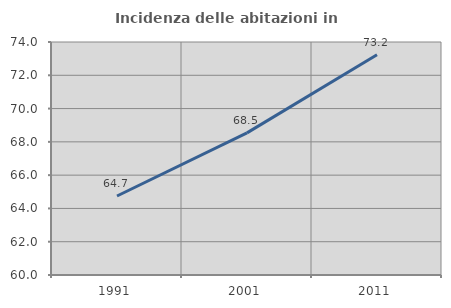
| Category | Incidenza delle abitazioni in proprietà  |
|---|---|
| 1991.0 | 64.747 |
| 2001.0 | 68.539 |
| 2011.0 | 73.234 |